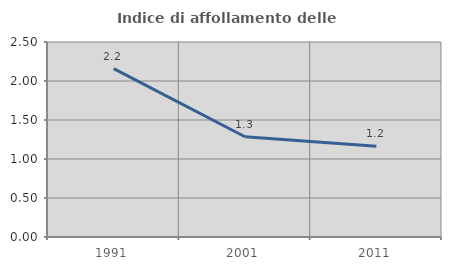
| Category | Indice di affollamento delle abitazioni  |
|---|---|
| 1991.0 | 2.159 |
| 2001.0 | 1.285 |
| 2011.0 | 1.163 |